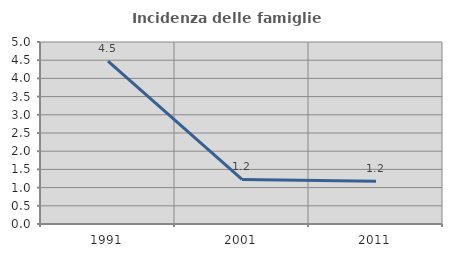
| Category | Incidenza delle famiglie numerose |
|---|---|
| 1991.0 | 4.478 |
| 2001.0 | 1.225 |
| 2011.0 | 1.176 |